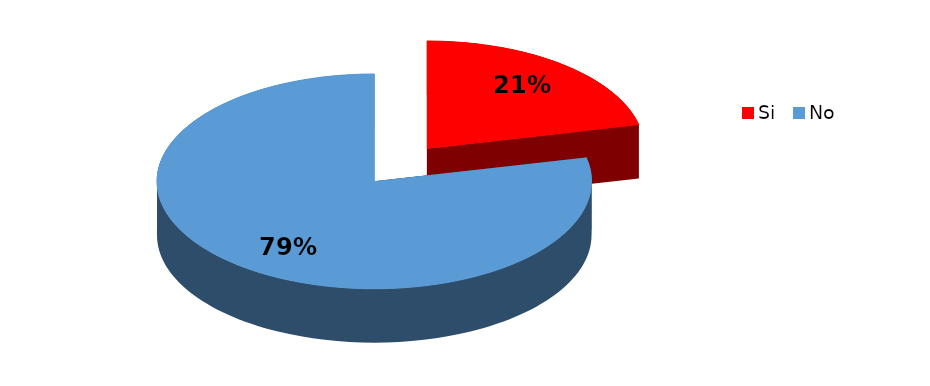
| Category | Frecuencia |
|---|---|
| Si | 3 |
| No | 11 |